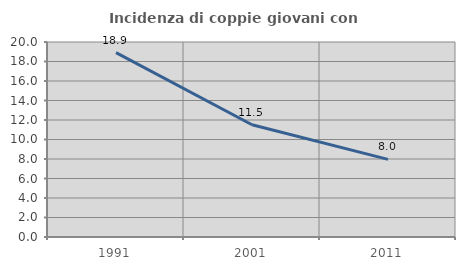
| Category | Incidenza di coppie giovani con figli |
|---|---|
| 1991.0 | 18.91 |
| 2001.0 | 11.517 |
| 2011.0 | 7.958 |